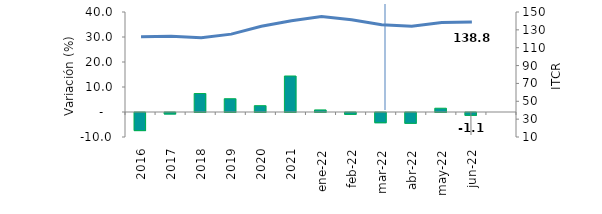
| Category | Series 0 |
|---|---|
| 2016 | -7.242 |
| 2017 | -0.602 |
| 2018 | 7.39 |
| 2019 | 5.308 |
| 2020 | 2.527 |
| 2021 | 14.394 |
| ene-22 | 0.83 |
| feb-22 | -0.741 |
| mar-22 | -4.089 |
| abr-22 | -4.319 |
| may-22 | 1.508 |
| jun-22 | -1.141 |